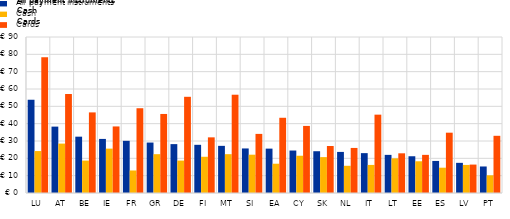
| Category | All payment instruments | Cash | Cards |
|---|---|---|---|
| LU | 53.8 | 24.2 | 78.3 |
| AT | 38.3 | 28.5 | 57.1 |
| BE | 32.5 | 18.7 | 46.5 |
| IE | 31.2 | 25.6 | 38.4 |
| FR | 30.1 | 13 | 48.9 |
| GR | 29.1 | 22.4 | 45.6 |
| DE | 28.2 | 18.7 | 55.5 |
| FI | 27.8 | 20.9 | 32.1 |
| MT | 27.2 | 22.4 | 56.7 |
| SI | 25.7 | 22.1 | 34.1 |
| EA | 25.6 | 16.9 | 43.4 |
| CY | 24.5 | 21.5 | 38.7 |
| SK | 24.1 | 20.7 | 27.1 |
| NL | 23.7 | 15.7 | 26 |
| IT | 23 | 16.2 | 45.2 |
| LT | 22 | 20 | 22.9 |
| EE | 21.2 | 18.3 | 22 |
| ES | 18.5 | 14.6 | 34.8 |
| LV | 17.4 | 16.2 | 16.4 |
| PT | 15.3 | 10.2 | 33 |